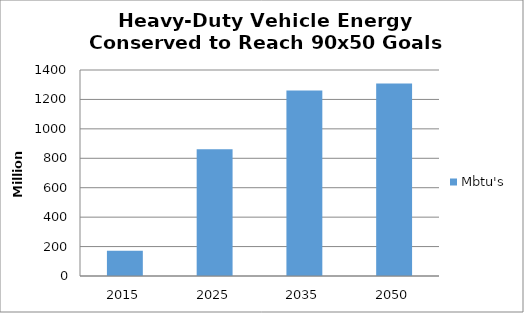
| Category | Mbtu's |
|---|---|
| 2015.0 | 172.378 |
| 2025.0 | 861.888 |
| 2035.0 | 1261.491 |
| 2050.0 | 1308.503 |